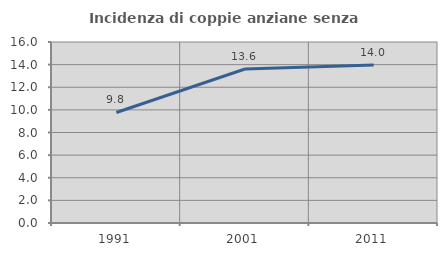
| Category | Incidenza di coppie anziane senza figli  |
|---|---|
| 1991.0 | 9.769 |
| 2001.0 | 13.612 |
| 2011.0 | 13.971 |